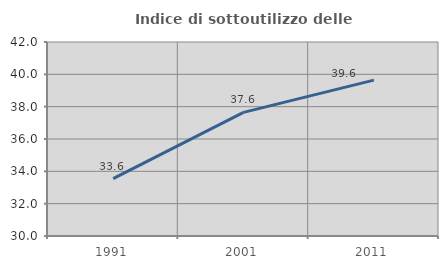
| Category | Indice di sottoutilizzo delle abitazioni  |
|---|---|
| 1991.0 | 33.554 |
| 2001.0 | 37.648 |
| 2011.0 | 39.644 |